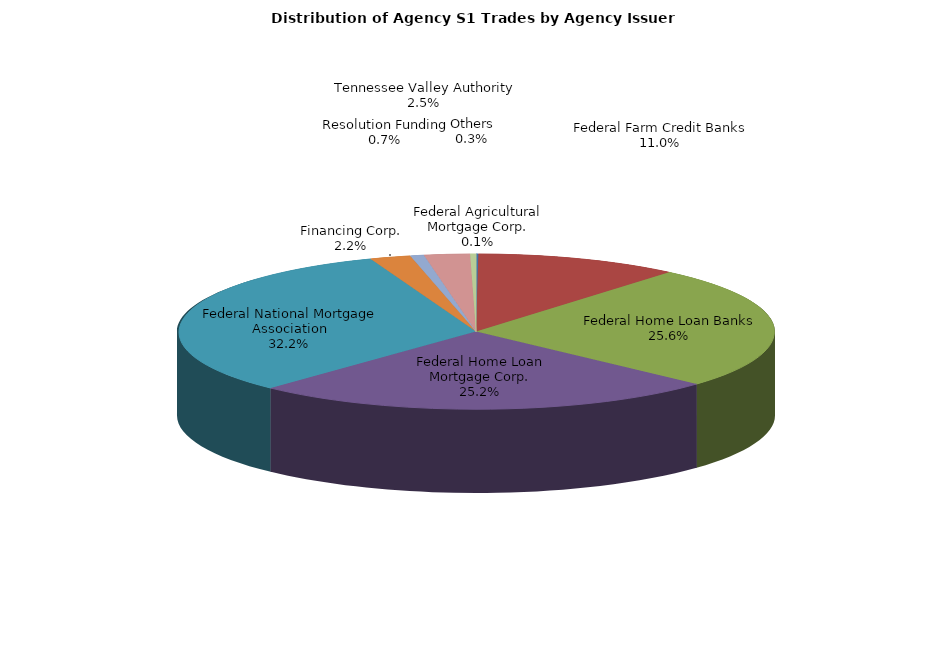
| Category | Series 0 |
|---|---|
| Federal Agricultural Mortgage Corp. | 7.285 |
| Federal Farm Credit Banks | 638.145 |
| Federal Home Loan Banks | 1480.808 |
| Federal Home Loan Mortgage Corp. | 1458.467 |
| Federal National Mortgage Association | 1862.336 |
| Financing Corp. | 127.435 |
| Resolution Funding | 42.659 |
| Tennessee Valley Authority | 142.621 |
| Others | 18.276 |